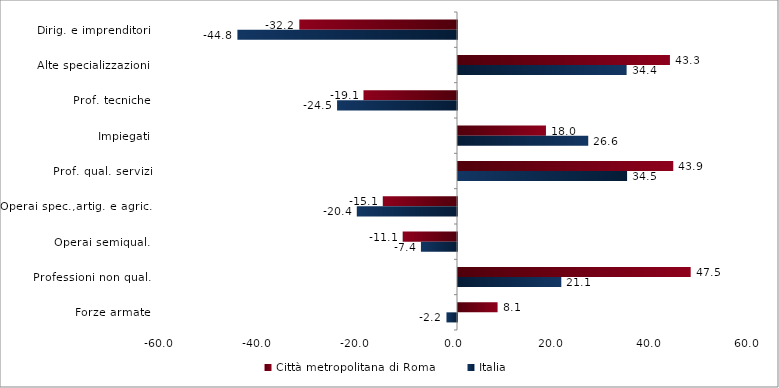
| Category | Città metropolitana di Roma  | Italia |
|---|---|---|
| Dirig. e imprenditori | -32.18 | -44.817 |
| Alte specializzazioni | 43.252 | 34.412 |
| Prof. tecniche | -19.074 | -24.474 |
| Impiegati | 17.951 | 26.574 |
| Prof. qual. servizi | 43.926 | 34.513 |
| Operai spec.,artig. e agric. | -15.145 | -20.448 |
| Operai semiqual. | -11.083 | -7.362 |
| Professioni non qual. | 47.486 | 21.076 |
| Forze armate | 8.077 | -2.151 |